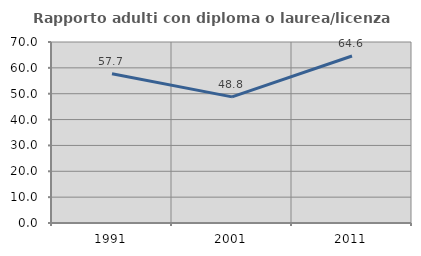
| Category | Rapporto adulti con diploma o laurea/licenza media  |
|---|---|
| 1991.0 | 57.692 |
| 2001.0 | 48.78 |
| 2011.0 | 64.583 |